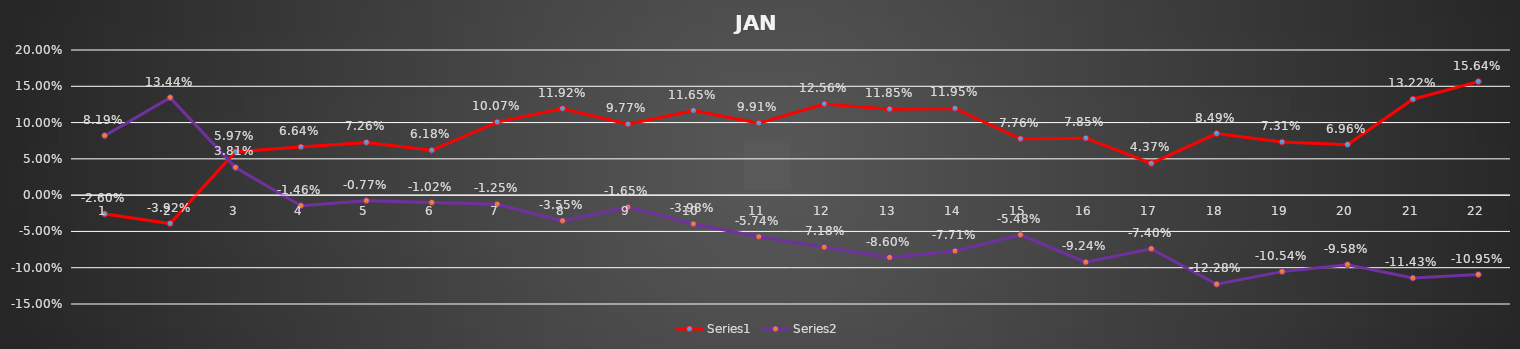
| Category | Series 0 | Series 1 |
|---|---|---|
| 0 | -0.026 | 0.082 |
| 1 | -0.039 | 0.134 |
| 2 | 0.06 | 0.038 |
| 3 | 0.066 | -0.015 |
| 4 | 0.073 | -0.008 |
| 5 | 0.062 | -0.01 |
| 6 | 0.101 | -0.012 |
| 7 | 0.119 | -0.036 |
| 8 | 0.098 | -0.016 |
| 9 | 0.116 | -0.04 |
| 10 | 0.099 | -0.057 |
| 11 | 0.126 | -0.072 |
| 12 | 0.118 | -0.086 |
| 13 | 0.12 | -0.077 |
| 14 | 0.078 | -0.055 |
| 15 | 0.078 | -0.092 |
| 16 | 0.044 | -0.074 |
| 17 | 0.085 | -0.123 |
| 18 | 0.073 | -0.105 |
| 19 | 0.07 | -0.096 |
| 20 | 0.132 | -0.114 |
| 21 | 0.156 | -0.11 |